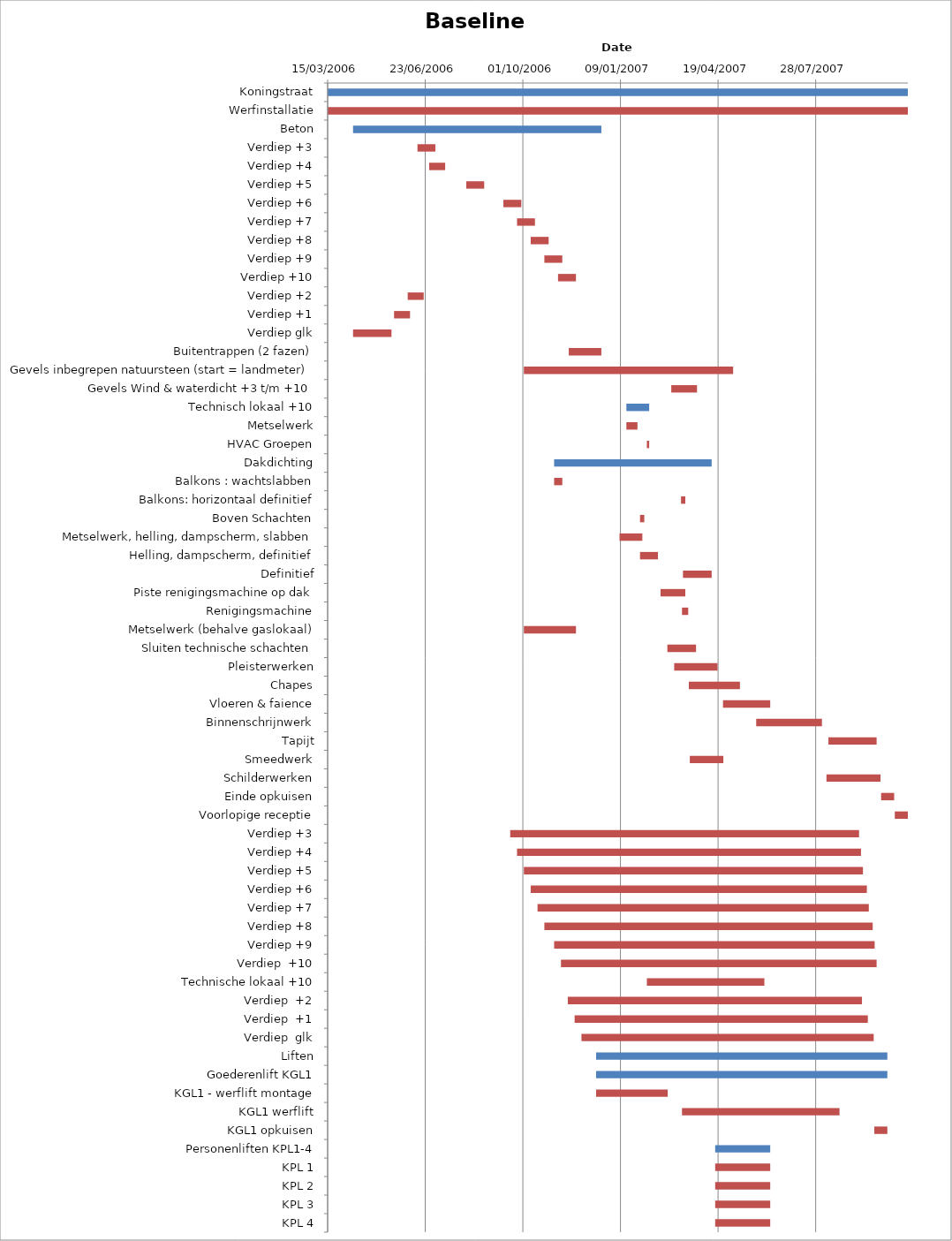
| Category | Baseline start | Actual duration |
|---|---|---|
| Koningstraat | 38791.333 | 594.375 |
| Werfinstallatie | 38791.333 | 594.375 |
| Beton | 38817.333 | 254.375 |
| Verdiep +3 | 38883.333 | 18.375 |
| Verdiep +4 | 38895.333 | 16.375 |
| Verdiep +5 | 38933.333 | 18.375 |
| Verdiep +6 | 38971.333 | 18.375 |
| Verdiep +7 | 38985.333 | 18.375 |
| Verdiep +8 | 38999.333 | 18.375 |
| Verdiep +9 | 39013.333 | 18.375 |
| Verdiep +10 | 39027.333 | 18.375 |
| Verdiep +2 | 38873.333 | 16.375 |
| Verdiep +1 | 38859.333 | 16.375 |
| Verdiep glk | 38817.333 | 39.375 |
| Buitentrappen (2 fazen) | 39038.333 | 33.375 |
| Gevels inbegrepen natuursteen (start = landmeter) | 38992.333 | 214.375 |
| Gevels Wind & waterdicht +3 t/m +10 | 39143.333 | 26.375 |
| Technisch lokaal +10 | 39097.333 | 23.375 |
| Metselwerk | 39097.333 | 11.375 |
| HVAC Groepen | 39118.333 | 2.375 |
| Dakdichting | 39023.333 | 161.375 |
| Balkons : wachtslabben | 39023.333 | 8.375 |
| Balkons: horizontaal definitief | 39153.333 | 4.375 |
| Boven Schachten | 39111.333 | 4.375 |
| Metselwerk, helling, dampscherm, slabben | 39090.333 | 23.375 |
| Helling, dampscherm, definitief | 39111.333 | 18.375 |
| Definitief | 39155.333 | 29.375 |
| Piste renigingsmachine op dak | 39132.333 | 25.375 |
| Renigingsmachine | 39154.333 | 6.375 |
| Metselwerk (behalve gaslokaal) | 38992.333 | 53.375 |
| Sluiten technische schachten | 39139.333 | 29.375 |
| Pleisterwerken | 39146.333 | 44.375 |
| Chapes | 39161.333 | 52.375 |
| Vloeren & faience | 39196.333 | 48.375 |
| Binnenschrijnwerk | 39230.333 | 67.375 |
| Tapijt | 39304.333 | 49.375 |
| Smeedwerk | 39162.333 | 34.375 |
| Schilderwerken | 39302.333 | 55.375 |
| Einde opkuisen | 39358.333 | 13.375 |
| Voorlopige receptie | 39372.333 | 13.375 |
| Verdiep +3 | 38978.333 | 357.375 |
| Verdiep +4 | 38985.333 | 352.375 |
| Verdiep +5 | 38992.333 | 347.375 |
| Verdiep +6 | 38999.333 | 344.375 |
| Verdiep +7 | 39006.333 | 339.375 |
| Verdiep +8 | 39013.333 | 336.375 |
| Verdiep +9 | 39023.333 | 328.375 |
| Verdiep  +10 | 39030.333 | 323.375 |
| Technische lokaal +10 | 39118.333 | 120.375 |
| Verdiep  +2 | 39037.333 | 301.375 |
| Verdiep  +1 | 39044.333 | 300.375 |
| Verdiep  glk | 39051.333 | 299.375 |
| Liften | 39066.333 | 298.375 |
| Goederenlift KGL1 | 39066.333 | 298.375 |
| KGL1 - werflift montage | 39066.333 | 73.375 |
| KGL1 werflift | 39154.333 | 161.375 |
| KGL1 opkuisen | 39351.333 | 13.375 |
| Personenliften KPL1-4 | 39188.333 | 56.375 |
| KPL 1 | 39188.333 | 56.375 |
| KPL 2 | 39188.333 | 56.375 |
| KPL 3 | 39188.333 | 56.375 |
| KPL 4 | 39188.333 | 56.375 |